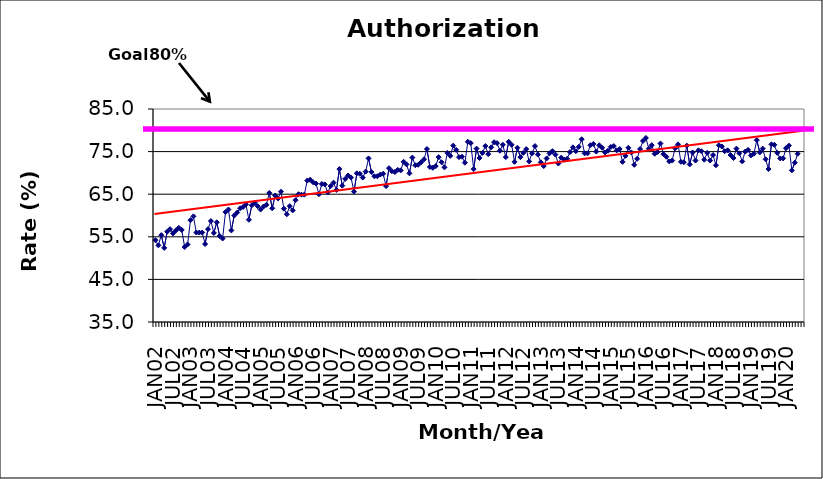
| Category | Series 0 |
|---|---|
| JAN02 | 54.2 |
| FEB02 | 53 |
| MAR02 | 55.4 |
| APR02 | 52.4 |
| MAY02 | 56.2 |
| JUN02 | 56.8 |
| JUL02 | 55.8 |
| AUG02 | 56.5 |
| SEP02 | 57.1 |
| OCT02 | 56.6 |
| NOV02 | 52.6 |
| DEC02 | 53.2 |
| JAN03 | 58.9 |
| FEB03 | 59.8 |
| MAR03 | 56 |
| APR03 | 56 |
| MAY03 | 56 |
| JUN03 | 53.3 |
| JUL03 | 56.8 |
| AUG03 | 58.7 |
| SEP03 | 55.9 |
| OCT03 | 58.4 |
| NOV03 | 55.2 |
| DEC03 | 54.6 |
| JAN04 | 60.8 |
| FEB04 | 61.4 |
| MAR04 | 56.5 |
| APR04 | 60 |
| MAY04 | 60.7 |
| JUN04 | 61.7 |
| JUL04 | 62 |
| AUG04 | 62.6 |
| SEP04 | 59 |
| OCT04 | 62.4 |
| NOV04 | 63 |
| DEC04 | 62.2 |
| JAN05 | 61.4 |
| FEB05 | 62.1 |
| MAR05 | 62.5 |
| APR05 | 65.3 |
| MAY05 | 61.7 |
| JUN05 | 64.7 |
| JUL05 | 64 |
| AUG05 | 65.6 |
| SEP05 | 61.6 |
| OCT05 | 60.3 |
| NOV05 | 62.2 |
| DEC05 | 61.2 |
| JAN06 | 63.6 |
| FEB06 | 65 |
| MAR06 | 64.9 |
| APR06 | 64.9 |
| MAY06 | 68.2 |
| JUN06 | 68.4 |
| JUL06 | 67.8 |
| AUG06 | 67.5 |
| SEP06 | 65 |
| OCT06 | 67.4 |
| NOV06 | 67.3 |
| DEC06 | 65.4 |
| JAN07 | 66.9 |
| FEB07 | 67.7 |
| MAR07 | 66 |
| APR07 | 70.9 |
| MAY07 | 67 |
| JUN07 | 68.6 |
| JUL07 | 69.4 |
| AUG07 | 68.9 |
| SEP07 | 65.6 |
| OCT07 | 69.9 |
| NOV07 | 69.8 |
| DEC07 | 68.9 |
| JAN08 | 70.3 |
| FEB08 | 73.4 |
| MAR08 | 70.2 |
| APR08 | 69.2 |
| MAY08 | 69.2 |
| JUN08 | 69.6 |
| JUL08 | 69.8 |
| AUG08 | 66.9 |
| SEP08 | 71.1 |
| OCT08 | 70.4 |
| NOV08 | 70.2 |
| DEC08 | 70.7 |
| JAN09 | 70.6 |
| FEB09 | 72.6 |
| MAR09 | 72 |
| APR09 | 69.9 |
| MAY09 | 73.6 |
| JUN09 | 71.8 |
| JUL09 | 71.9 |
| AUG09 | 72.5 |
| SEP09 | 73.2 |
| OCT09 | 75.6 |
| NOV09 | 71.4 |
| DEC09 | 71.2 |
| JAN10 | 71.6 |
| FEB10 | 73.7 |
| MAR10 | 72.5 |
| APR10 | 71.3 |
| MAY10 | 74.7 |
| JUN10 | 74 |
| JUL10 | 76.4 |
| AUG10 | 75.4 |
| SEP10 | 73.7 |
| OCT10 | 73.8 |
| NOV10 | 72.4 |
| DEC10 | 77.3 |
| JAN11 | 77 |
| FEB11 | 70.9 |
| MAR11 | 75.7 |
| APR11 | 73.5 |
| MAY11 | 74.7 |
| JUN11 | 76.3 |
| JUL11 | 74.4 |
| AUG11 | 76 |
| SEP11 | 77.2 |
| OCT11 | 77 |
| NOV11 | 75.2 |
| DEC11 | 76.6 |
| JAN12 | 73.7 |
| FEB12 | 77.3 |
| MAR12 | 76.6 |
| APR12 | 72.6 |
| MAY12 | 75.9 |
| JUN12 | 73.7 |
| JUL12 | 74.7 |
| AUG12 | 75.6 |
| SEP12 | 72.7 |
| OCT12 | 74.6 |
| NOV12 | 76.3 |
| DEC12 | 74.3 |
| JAN13 | 72.5 |
| FEB13 | 71.6 |
| MAR13 | 73.4 |
| APR13 | 74.6 |
| MAY13 | 75.1 |
| JUN13 | 74.3 |
| JUL13 | 72.2 |
| AUG13 | 73.6 |
| SEP13 | 73.1 |
| OCT13 | 73.3 |
| NOV13 | 74.9 |
| DEC13 | 76 |
| JAN14 | 75.1 |
| FEB14 | 76.1 |
| MAR14 | 77.9 |
| APR14 | 74.6 |
| MAY14 | 74.6 |
| JUN14 | 76.5 |
| JUL14 | 76.8 |
| AUG14 | 75 |
| SEP14 | 76.5 |
| OCT14 | 75.9 |
| NOV14 | 74.8 |
| DEC14 | 75.2 |
| JAN15 | 76.1 |
| FEB15 | 76.3 |
| MAR15 | 75.3 |
| APR15 | 75.6 |
| MAY15 | 72.6 |
| JUN15 | 74 |
| JUL15 | 75.9 |
| AUG15 | 74.8 |
| SEP15 | 71.9 |
| OCT15 | 73.3 |
| NOV15 | 75.6 |
| DEC15 | 77.5 |
| JAN16 | 78.2 |
| FEB16 | 75.7 |
| MAR16 | 76.5 |
| APR16 | 74.5 |
| MAY16 | 74.9 |
| JUN16 | 76.9 |
| JUL16 | 74.4 |
| AUG16 | 73.8 |
| SEP16 | 72.7 |
| OCT16 | 72.9 |
| NOV16 | 75.8 |
| DEC16 | 76.7 |
| JAN17 | 72.6 |
| FEB17 | 72.5 |
| MAR17 | 76.4 |
| APR17 | 72 |
| MAY17 | 74.8 |
| JUN17 | 72.9 |
| JUL17 | 75.3 |
| AUG17 | 75.1 |
| SEP17 | 73.1 |
| OCT17 | 74.7 |
| NOV17 | 72.9 |
| DEC17 | 74.2 |
| JAN18 | 71.8 |
| FEB18 | 76.5 |
| MAR18 | 76.2 |
| APR18 | 75.1 |
| MAY18 | 75.3 |
| JUN18 | 74.2 |
| JUL18 | 73.5 |
| AUG18 | 75.7 |
| SEP18 | 74.6 |
| OCT18 | 72.7 |
| NOV18 | 75 |
| DEC18 | 75.4 |
| JAN19 | 74.1 |
| FEB19 | 74.5 |
| MAR19 | 77.7 |
| APR19 | 74.8 |
| MAY19 | 75.7 |
| JUN19 | 73.2 |
| JUL19 | 70.9 |
| AUG19 | 76.7 |
| SEP19 | 76.6 |
| OCT19 | 74.7 |
| NOV19 | 73.4 |
| DEC19 | 73.4 |
| JAN20 | 75.8 |
| FEB20 | 76.4 |
| MAR20 | 70.6 |
| APR20 | 72.4 |
| MAY20 | 74.5 |